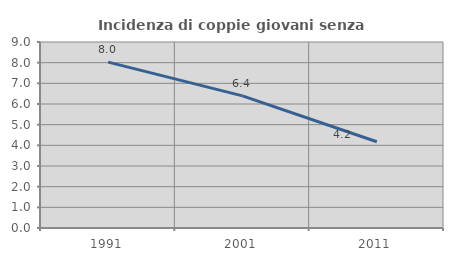
| Category | Incidenza di coppie giovani senza figli |
|---|---|
| 1991.0 | 8.028 |
| 2001.0 | 6.393 |
| 2011.0 | 4.174 |